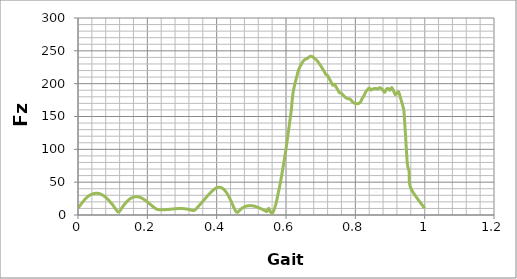
| Category | Series 0 |
|---|---|
| 0.0 | 10.214 |
| 0.005 | 13.997 |
| 0.01 | 17.251 |
| 0.015 | 20.772 |
| 0.02 | 23.861 |
| 0.025 | 26.543 |
| 0.03 | 28.753 |
| 0.035 | 30.401 |
| 0.04 | 31.736 |
| 0.045 | 32.548 |
| 0.05 | 32.986 |
| 0.055 | 33.046 |
| 0.06 | 32.739 |
| 0.065 | 31.833 |
| 0.07 | 30.537 |
| 0.075 | 28.82 |
| 0.08 | 26.993 |
| 0.085 | 24.497 |
| 0.09 | 21.599 |
| 0.095 | 18.414 |
| 0.1 | 15.584 |
| 0.105 | 11.534 |
| 0.11 | 8.116 |
| 0.115 | 4.697 |
| 0.12 | 5.646 |
| 0.125 | 9.543 |
| 0.13 | 13.36 |
| 0.135 | 16.855 |
| 0.14 | 19.929 |
| 0.145 | 22.553 |
| 0.15 | 24.652 |
| 0.155 | 26.16 |
| 0.16 | 27.135 |
| 0.165 | 27.789 |
| 0.17 | 27.944 |
| 0.175 | 27.54 |
| 0.18 | 26.683 |
| 0.185 | 25.422 |
| 0.19 | 23.824 |
| 0.195 | 21.964 |
| 0.2 | 19.917 |
| 0.205 | 17.772 |
| 0.21 | 15.57 |
| 0.215 | 13.424 |
| 0.22 | 11.367 |
| 0.225 | 9.391 |
| 0.23 | 8.403 |
| 0.235 | 8.108 |
| 0.24 | 7.968 |
| 0.245 | 7.988 |
| 0.25 | 8.084 |
| 0.255 | 8.251 |
| 0.26 | 8.45 |
| 0.265 | 8.693 |
| 0.27 | 8.957 |
| 0.275 | 9.219 |
| 0.28 | 9.472 |
| 0.285 | 9.679 |
| 0.29 | 9.784 |
| 0.295 | 9.867 |
| 0.3 | 9.809 |
| 0.305 | 9.668 |
| 0.31 | 9.266 |
| 0.315 | 8.987 |
| 0.32 | 8.407 |
| 0.325 | 7.598 |
| 0.33 | 7.001 |
| 0.335 | 6.972 |
| 0.34 | 8.957 |
| 0.345 | 11.716 |
| 0.35 | 14.747 |
| 0.355 | 17.693 |
| 0.36 | 20.773 |
| 0.365 | 23.886 |
| 0.37 | 27.003 |
| 0.375 | 30.012 |
| 0.38 | 32.861 |
| 0.385 | 35.51 |
| 0.39 | 37.873 |
| 0.395 | 39.919 |
| 0.4 | 41.655 |
| 0.405 | 42.126 |
| 0.41 | 42.083 |
| 0.415 | 41.13 |
| 0.42 | 39.254 |
| 0.425 | 36.463 |
| 0.43 | 32.744 |
| 0.435 | 28.133 |
| 0.44 | 22.736 |
| 0.445 | 16.787 |
| 0.45 | 10.769 |
| 0.455 | 5.693 |
| 0.46 | 3.987 |
| 0.465 | 6.339 |
| 0.47 | 8.942 |
| 0.475 | 10.867 |
| 0.48 | 12.304 |
| 0.485 | 13.332 |
| 0.49 | 13.982 |
| 0.495 | 14.265 |
| 0.5 | 14.213 |
| 0.505 | 13.855 |
| 0.51 | 13.197 |
| 0.515 | 12.351 |
| 0.52 | 11.341 |
| 0.525 | 10.216 |
| 0.53 | 9.011 |
| 0.535 | 7.751 |
| 0.54 | 6.492 |
| 0.545 | 5.342 |
| 0.55 | 10.302 |
| 0.555 | 5.017 |
| 0.56 | 2.404 |
| 0.565 | 7.142 |
| 0.57 | 15.298 |
| 0.575 | 26.671 |
| 0.58 | 39.429 |
| 0.585 | 52.779 |
| 0.59 | 68.076 |
| 0.595 | 83.699 |
| 0.6 | 100.497 |
| 0.605 | 119.218 |
| 0.61 | 139.127 |
| 0.615 | 158.568 |
| 0.62 | 184.97 |
| 0.625 | 198.192 |
| 0.63 | 208.522 |
| 0.635 | 218.734 |
| 0.64 | 225.528 |
| 0.645 | 230.319 |
| 0.65 | 234.655 |
| 0.655 | 236.873 |
| 0.66 | 237.965 |
| 0.665 | 240.016 |
| 0.67 | 241.511 |
| 0.675 | 241.339 |
| 0.68 | 239.355 |
| 0.685 | 237.396 |
| 0.69 | 234.714 |
| 0.695 | 231.272 |
| 0.7 | 227.37 |
| 0.705 | 223.164 |
| 0.71 | 218.707 |
| 0.715 | 214.028 |
| 0.72 | 212.391 |
| 0.725 | 207.473 |
| 0.73 | 202.519 |
| 0.735 | 197.565 |
| 0.74 | 199.142 |
| 0.745 | 194.473 |
| 0.75 | 190.01 |
| 0.755 | 185.878 |
| 0.76 | 185.48 |
| 0.765 | 182.29 |
| 0.77 | 179.72 |
| 0.775 | 177.91 |
| 0.78 | 176.934 |
| 0.785 | 176.515 |
| 0.79 | 173.251 |
| 0.795 | 171.008 |
| 0.8 | 169.783 |
| 0.805 | 169.466 |
| 0.81 | 169.957 |
| 0.815 | 172.048 |
| 0.82 | 177.536 |
| 0.825 | 181.843 |
| 0.83 | 187.573 |
| 0.835 | 190.552 |
| 0.84 | 193.493 |
| 0.845 | 190.319 |
| 0.85 | 191.788 |
| 0.855 | 192.601 |
| 0.86 | 192.627 |
| 0.865 | 191.76 |
| 0.87 | 193.95 |
| 0.875 | 192.546 |
| 0.88 | 189.989 |
| 0.885 | 186.89 |
| 0.89 | 191.818 |
| 0.895 | 192.673 |
| 0.9 | 189.88 |
| 0.905 | 194.207 |
| 0.91 | 189.35 |
| 0.915 | 183.453 |
| 0.92 | 185.643 |
| 0.925 | 187.359 |
| 0.93 | 178.832 |
| 0.935 | 169.896 |
| 0.94 | 160.087 |
| 0.945 | 119.96 |
| 0.95 | 78.309 |
| 0.955 | 66.212 |
| 0.96 | 40.814 |
| 1.0 | 10.214 |